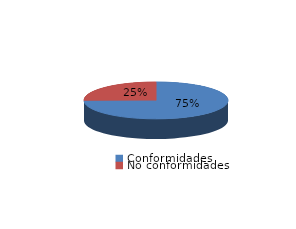
| Category | Series 0 |
|---|---|
| Conformidades | 579 |
| No conformidades | 196 |